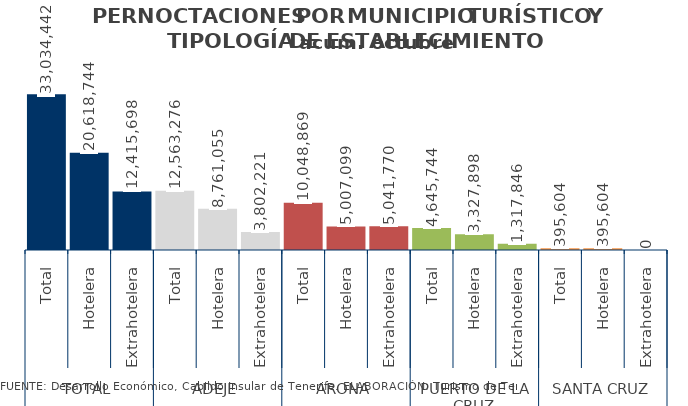
| Category | acum. octubre 2014 |
|---|---|
| 0 | 33034442 |
| 1 | 20618744 |
| 2 | 12415698 |
| 3 | 12563276 |
| 4 | 8761055 |
| 5 | 3802221 |
| 6 | 10048869 |
| 7 | 5007099 |
| 8 | 5041770 |
| 9 | 4645744 |
| 10 | 3327898 |
| 11 | 1317846 |
| 12 | 395604 |
| 13 | 395604 |
| 14 | 0 |